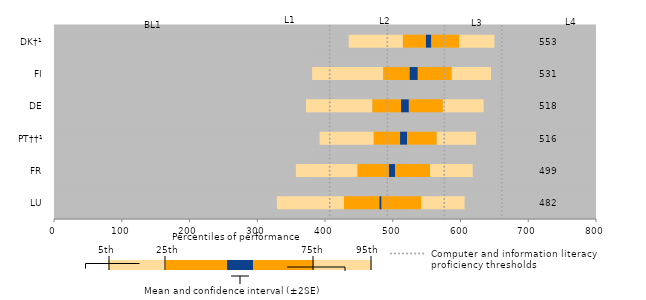
| Category | Start 5th percentile | 5th and 95th percentiles | 25th and 75th percentiles | Mean and confidence interval (±2SE) | End of chart |
|---|---|---|---|---|---|
| LU | 329 | 64 | 58.4 | 3.2 | 144 |
| FR | 357 | 63 | 51.4 | 9.2 | 132 |
| PT††¹ | 392 | 58 | 43.8 | 10.4 | 127 |
| DE | 372 | 60 | 50.2 | 11.6 | 116 |
| FI | 381 | 58 | 50 | 12 | 105 |
| DK†¹ | 435 | 52 | 41 | 8 | 100 |